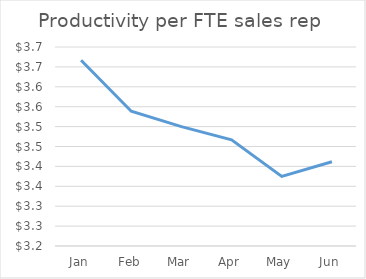
| Category | Productivity per FTE sales rep |
|---|---|
| Jan | 3.667 |
| Feb | 3.538 |
| Mar | 3.5 |
| Apr | 3.467 |
| May | 3.375 |
| Jun | 3.412 |